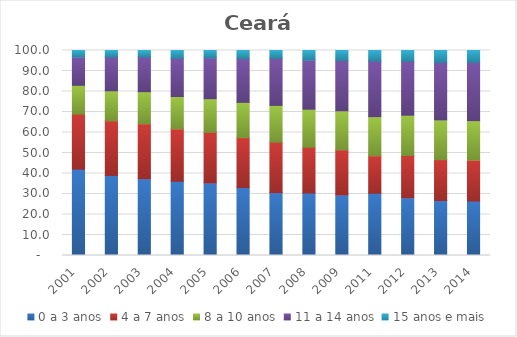
| Category | 0 a 3 anos | 4 a 7 anos | 8 a 10 anos | 11 a 14 anos | 15 anos e mais |
|---|---|---|---|---|---|
| 2001.0 | 42.12 | 26.86 | 14.04 | 13.85 | 3.13 |
| 2002.0 | 39.06 | 26.69 | 14.55 | 16.5 | 3.2 |
| 2003.0 | 37.46 | 26.8 | 15.65 | 16.91 | 3.17 |
| 2004.0 | 36.21 | 25.58 | 15.78 | 18.58 | 3.85 |
| 2005.0 | 35.43 | 24.63 | 16.4 | 20.01 | 3.53 |
| 2006.0 | 33.14 | 24.36 | 17.2 | 21.37 | 3.94 |
| 2007.0 | 30.68 | 24.61 | 17.92 | 22.97 | 3.82 |
| 2008.0 | 30.48 | 22.32 | 18.56 | 24.05 | 4.59 |
| 2009.0 | 29.53 | 22.04 | 18.99 | 24.58 | 4.87 |
| 2011.0 | 30.34 | 18.33 | 19.06 | 27.12 | 5.14 |
| 2012.0 | 28.18 | 20.62 | 19.64 | 26.31 | 5.26 |
| 2013.0 | 26.81 | 19.99 | 19.31 | 28.1 | 5.79 |
| 2014.0 | 26.56 | 20.03 | 19.19 | 28.45 | 5.77 |